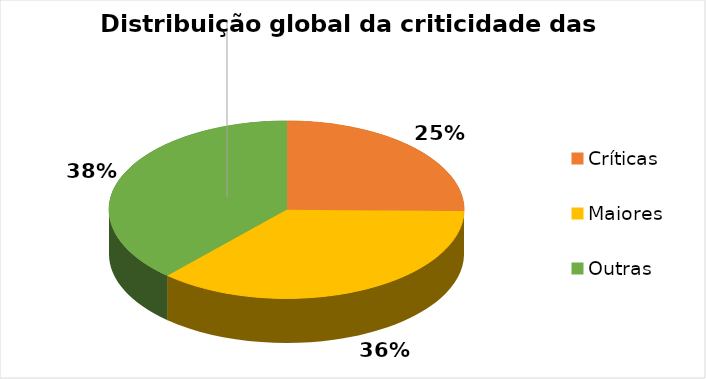
| Category | Distribuição da criticidade das não-conformidades |
|---|---|
| Críticas | 0.252 |
| Maiores | 0.364 |
| Outras | 0.383 |